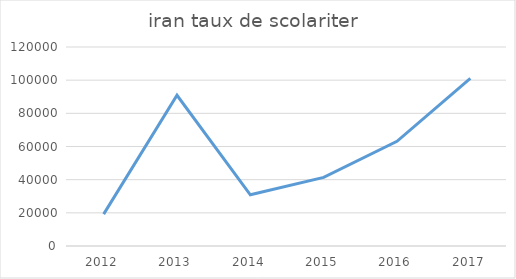
| Category | taux de scolariter  |
|---|---|
| 2012.0 | 19227 |
| 2013.0 | 90884 |
| 2014.0 | 30869 |
| 2015.0 | 41355 |
| 2016.0 | 63106 |
| 2017.0 | 101141 |